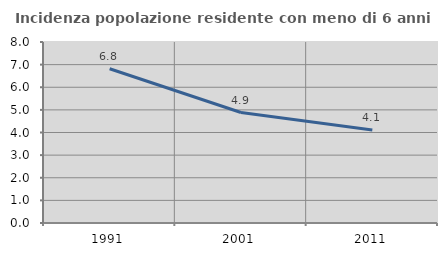
| Category | Incidenza popolazione residente con meno di 6 anni |
|---|---|
| 1991.0 | 6.82 |
| 2001.0 | 4.882 |
| 2011.0 | 4.106 |